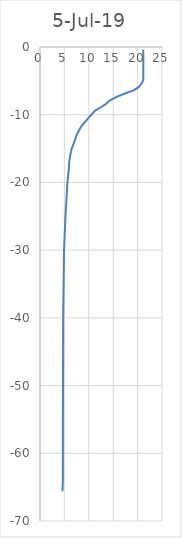
| Category | 5-Jul-19 |
|---|---|
| 21.1480967 | -0.4 |
| 21.1639016 | -1 |
| 21.1792145 | -1.4 |
| 21.1736724 | -1.9 |
| 21.1748916 | -2.4 |
| 21.1673543 | -2.9 |
| 21.1701281 | -3.4 |
| 21.1613718 | -3.9 |
| 21.1728009 | -4.4 |
| 21.1616751 | -4.9 |
| 20.8291139 | -5.4 |
| 20.2802221 | -5.9 |
| 19.1839122 | -6.4 |
| 17.219207 | -6.9 |
| 15.6005095 | -7.4 |
| 14.2542894 | -7.9 |
| 13.5196786 | -8.4 |
| 12.4832166 | -8.9 |
| 11.2984571 | -9.4 |
| 10.6485458 | -9.9 |
| 10.0286424 | -10.4 |
| 9.41734542 | -10.9 |
| 8.83429803 | -11.4 |
| 8.32728807 | -11.9 |
| 7.8512199 | -12.5 |
| 7.50590224 | -13 |
| 7.27900101 | -13.5 |
| 7.02077848 | -14 |
| 6.50212004 | -15 |
| 6.19271884 | -16 |
| 5.97833783 | -17 |
| 5.90043856 | -18 |
| 5.62575041 | -20 |
| 5.21696206 | -25 |
| 4.92443786 | -30 |
| 4.74319191 | -40.5 |
| 4.71094037 | -51 |
| 4.69059937 | -56 |
| 4.69220713 | -61 |
| 4.68887647 | -64 |
| 4.64608841 | -65 |
| 4.60504969 | -65.6 |